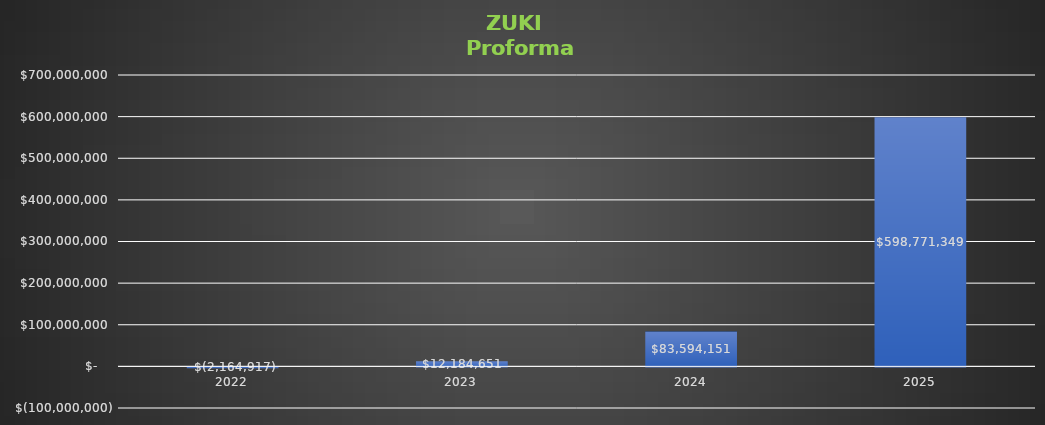
| Category | Series 0 |
|---|---|
| 2022 | -2164916.822 |
| 2023 | 12184651.379 |
| 2024 | 83594151.032 |
| 2025 | 598771349.43 |